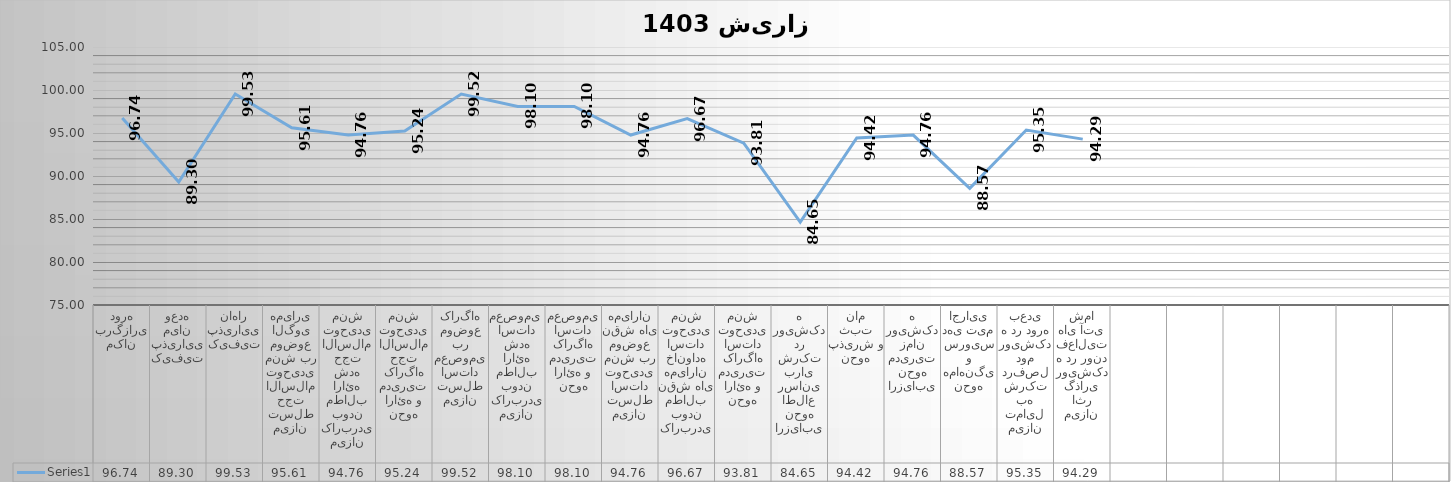
| Category | Series 0 |
|---|---|
| مکان برگزاری دوره | 96.744 |
| کیفیت پذیرایی میان وعده | 89.302 |
| کیفیت پذیرایی ناهار | 99.535 |
| میزان تسلط حجت الاسلام توحیدی منش بر موضوع الگوی همیاری | 95.61 |
| میزان کاربردی بودن مطالب ارائه شده حجت الاسلام توحیدی منش | 94.762 |
| نحوه ارائه و مدیریت کارگاه حجت الاسلام توحیدی منش | 95.238 |
| میزان تسلط استاد معصومی بر موضوع کارگاه | 99.524 |
| میزان کاربردی بودن مطالب ارائه شده استاد معصومی  | 98.095 |
| نحوه ارائه و مدیریت کارگاه استاد معصومی | 98.095 |
| میزان تسلط استاد توحیدی منش بر موضوع نقش های همیاران | 94.762 |
| کاربردی بودن مطالب نقش های همیاران خانواده استاد توحیدی منش | 96.667 |
| نحوه ارائه و مدیریت کارگاه استاد توحیدی منش | 93.81 |
| ارزیابی نحوه اطلاع رسانی برای شرکت در رویشکده | 84.651 |
| نحوه پذیرش و ثبت نام | 94.419 |
| ارزیابی نحوه مدیریت زمان رویشکده | 94.762 |
| نحوه هماهنگی و سرویس دهی تیم اجرایی | 88.571 |
| میزان تمایل به شرکت درفصل دوم رویشکده در دوره بعدی | 95.349 |
| میزان اثر گذاری رویشکده در روند فعالیت های آتی شما | 94.286 |